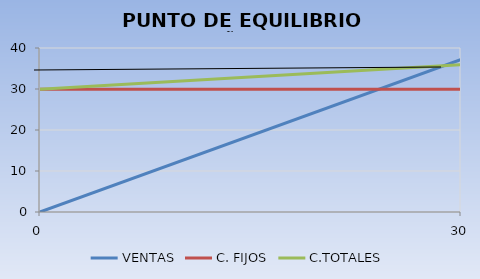
| Category | VENTAS | C. FIJOS | C.TOTALES |
|---|---|---|---|
| 0.0 | 0 | 29.94 | 29.94 |
| 30.0 | 37.2 | 29.94 | 35.94 |